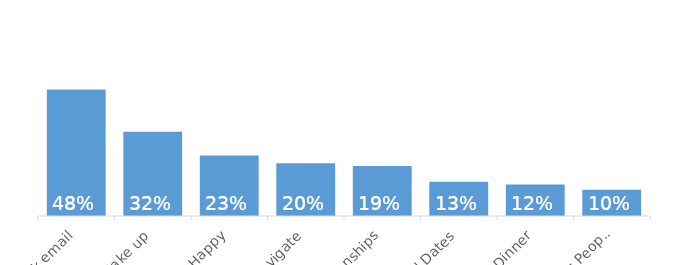
| Category | Series 0 |
|---|---|
| Check email | 0.48 |
| Wake up | 0.32 |
| Feel Happy | 0.23 |
| Navigate | 0.2 |
| Relationships | 0.19 |
| Find Dates | 0.13 |
| Order Dinner | 0.12 |
| Impress People | 0.1 |